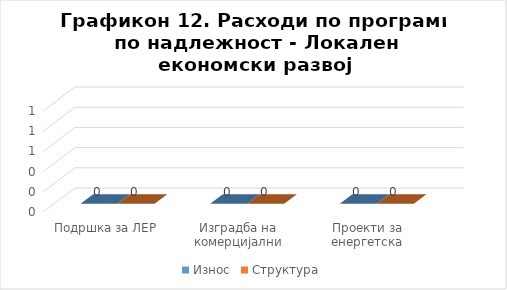
| Category | Износ | Структура |
|---|---|---|
| Подршка за ЛЕР | 0 | 0 |
| Изградба на комерцијални објекти | 0 | 0 |
| Проекти за енергетска ефикасност | 0 | 0 |